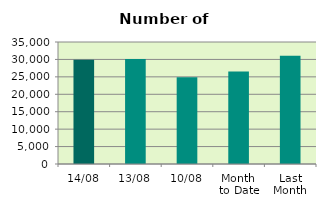
| Category | Series 0 |
|---|---|
| 14/08 | 29918 |
| 13/08 | 30110 |
| 10/08 | 24894 |
| Month 
to Date | 26561.8 |
| Last
Month | 31061.545 |